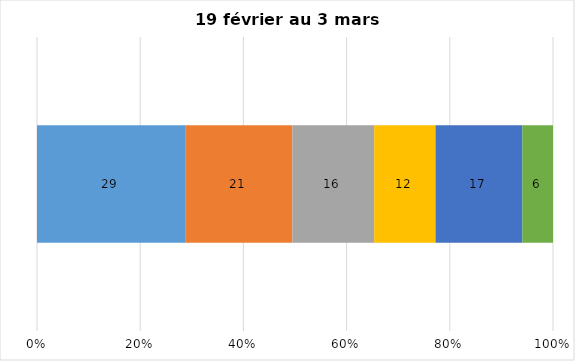
| Category | Plusieurs fois par jour | Une fois par jour | Quelques fois par semaine   | Une fois par semaine ou moins   |  Jamais   |  Je n’utilise pas les médias sociaux |
|---|---|---|---|---|---|---|
| 0 | 29 | 21 | 16 | 12 | 17 | 6 |